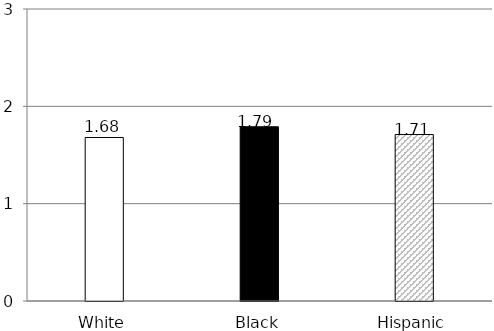
| Category | Series 0 |
|---|---|
| White | 1.68 |
| Black | 1.79 |
| Hispanic | 1.71 |